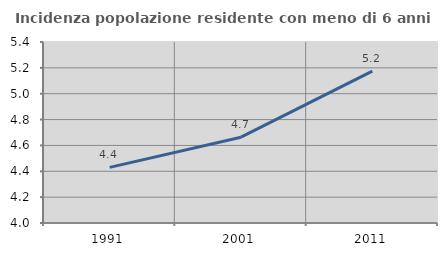
| Category | Incidenza popolazione residente con meno di 6 anni |
|---|---|
| 1991.0 | 4.43 |
| 2001.0 | 4.664 |
| 2011.0 | 5.174 |